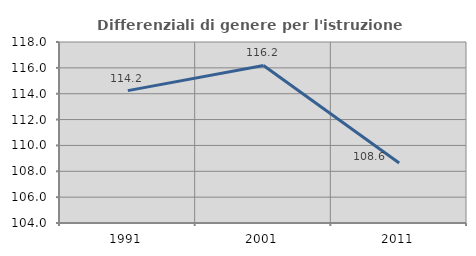
| Category | Differenziali di genere per l'istruzione superiore |
|---|---|
| 1991.0 | 114.237 |
| 2001.0 | 116.186 |
| 2011.0 | 108.637 |